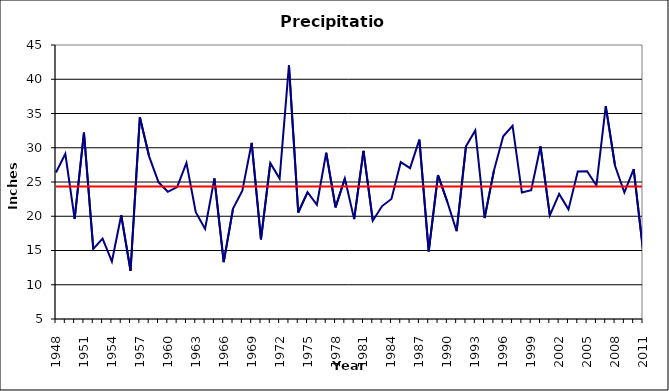
| Category | Series 0 | Series 1 |
|---|---|---|
| 1948.0 | 26.38 | 24.33 |
| 1949.0 | 29.103 | 24.33 |
| 1950.0 | 19.62 | 24.33 |
| 1951.0 | 32.2 | 24.33 |
| 1952.0 | 15.243 | 24.33 |
| 1953.0 | 16.742 | 24.33 |
| 1954.0 | 13.39 | 24.33 |
| 1955.0 | 20.15 | 24.33 |
| 1956.0 | 12.043 | 24.33 |
| 1957.0 | 34.465 | 24.33 |
| 1958.0 | 28.708 | 24.33 |
| 1959.0 | 24.978 | 24.33 |
| 1960.0 | 23.572 | 24.33 |
| 1961.0 | 24.268 | 24.33 |
| 1962.0 | 27.788 | 24.33 |
| 1963.0 | 20.585 | 24.33 |
| 1964.0 | 18.147 | 24.33 |
| 1965.0 | 25.533 | 24.33 |
| 1966.0 | 13.308 | 24.33 |
| 1967.0 | 21.112 | 24.33 |
| 1968.0 | 23.718 | 24.33 |
| 1969.0 | 30.708 | 24.33 |
| 1970.0 | 16.62 | 24.33 |
| 1971.0 | 27.758 | 24.33 |
| 1972.0 | 25.508 | 24.33 |
| 1973.0 | 42.043 | 24.33 |
| 1974.0 | 20.552 | 24.33 |
| 1975.0 | 23.518 | 24.33 |
| 1976.0 | 21.675 | 24.33 |
| 1977.0 | 29.268 | 24.33 |
| 1978.0 | 21.293 | 24.33 |
| 1979.0 | 25.497 | 24.33 |
| 1980.0 | 19.577 | 24.33 |
| 1981.0 | 29.535 | 24.33 |
| 1982.0 | 19.345 | 24.33 |
| 1983.0 | 21.485 | 24.33 |
| 1984.0 | 22.522 | 24.33 |
| 1985.0 | 27.898 | 24.33 |
| 1986.0 | 27.022 | 24.33 |
| 1987.0 | 31.182 | 24.33 |
| 1988.0 | 14.875 | 24.33 |
| 1989.0 | 26.015 | 24.33 |
| 1990.0 | 22.105 | 24.33 |
| 1991.0 | 17.815 | 24.33 |
| 1992.0 | 30.208 | 24.33 |
| 1993.0 | 32.522 | 24.33 |
| 1994.0 | 19.74 | 24.33 |
| 1995.0 | 26.663 | 24.33 |
| 1996.0 | 31.672 | 24.33 |
| 1997.0 | 33.215 | 24.33 |
| 1998.0 | 23.46 | 24.33 |
| 1999.0 | 23.798 | 24.33 |
| 2000.0 | 30.208 | 24.33 |
| 2001.0 | 20.12 | 24.33 |
| 2002.0 | 23.255 | 24.33 |
| 2003.0 | 21.005 | 24.33 |
| 2004.0 | 26.528 | 24.33 |
| 2005.0 | 26.578 | 24.33 |
| 2006.0 | 24.488 | 24.33 |
| 2007.0 | 36.07 | 24.33 |
| 2008.0 | 27.37 | 24.33 |
| 2009.0 | 23.472 | 24.33 |
| 2010.0 | 26.875 | 24.33 |
| 2011.0 | 15.09 | 24.33 |